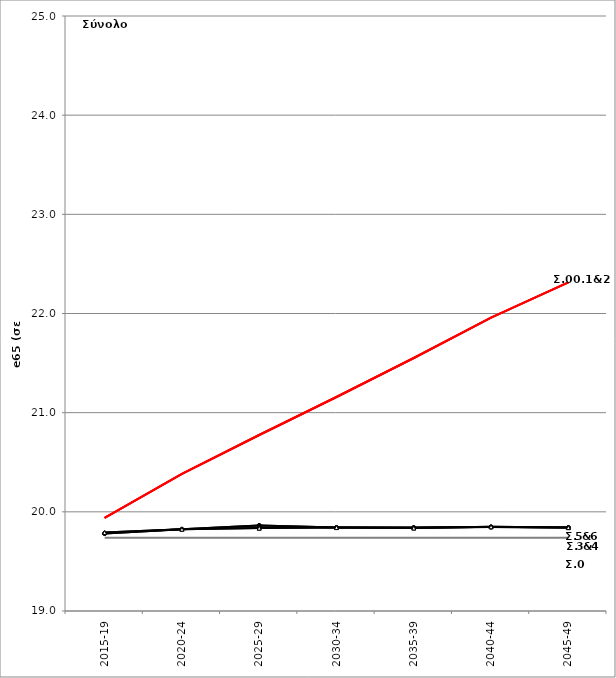
| Category | Σ0.e65 | Σ00.e65 | Σ1.e65 | Σ2.e65 | Σ3.e65 | Σ4.e65 | Σ5.e65 | Σ6.e65 |
|---|---|---|---|---|---|---|---|---|
| 2015-19 | 19.74 | 19.94 | 19.94 | 19.94 | 19.782 | 19.782 | 19.791 | 19.791 |
| 2020-24 | 19.74 | 20.383 | 20.383 | 20.383 | 19.824 | 19.824 | 19.825 | 19.825 |
| 2025-29 | 19.74 | 20.775 | 20.775 | 20.775 | 19.862 | 19.862 | 19.836 | 19.836 |
| 2030-34 | 19.74 | 21.158 | 21.158 | 21.158 | 19.842 | 19.842 | 19.841 | 19.841 |
| 2035-39 | 19.74 | 21.551 | 21.551 | 21.551 | 19.841 | 19.841 | 19.837 | 19.837 |
| 2040-44 | 19.74 | 21.958 | 21.958 | 21.958 | 19.848 | 19.848 | 19.85 | 19.85 |
| 2045-49 | 19.74 | 22.314 | 22.314 | 22.314 | 19.842 | 19.842 | 19.841 | 19.841 |